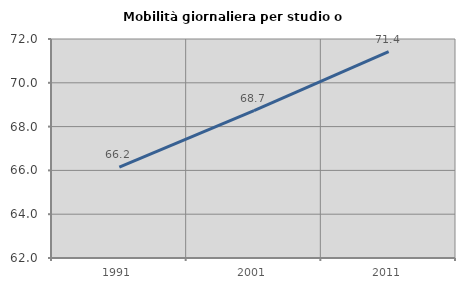
| Category | Mobilità giornaliera per studio o lavoro |
|---|---|
| 1991.0 | 66.154 |
| 2001.0 | 68.725 |
| 2011.0 | 71.429 |